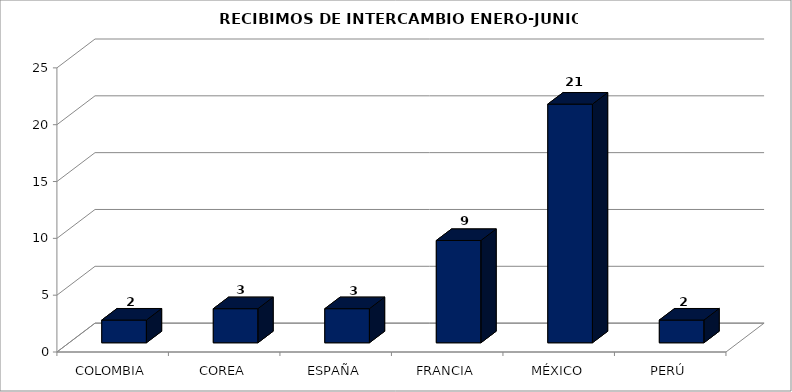
| Category | ALUMNOS |
|---|---|
| COLOMBIA | 2 |
| COREA | 3 |
| ESPAÑA | 3 |
| FRANCIA | 9 |
| MÉXICO | 21 |
| PERÚ | 2 |